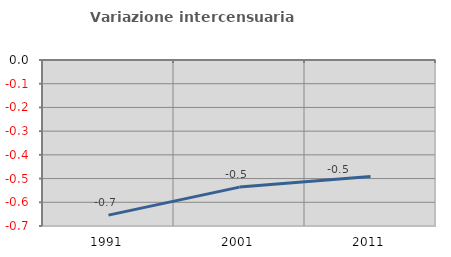
| Category | Variazione intercensuaria annua |
|---|---|
| 1991.0 | -0.654 |
| 2001.0 | -0.536 |
| 2011.0 | -0.491 |